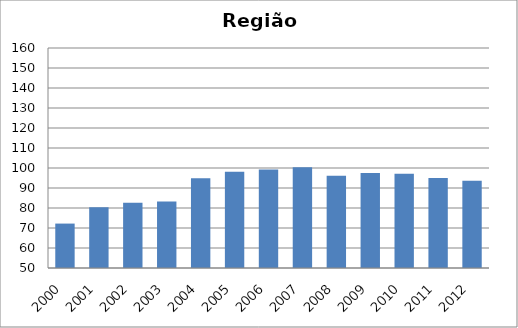
| Category | Hepatite B |
|---|---|
| 2000.0 | 72.21 |
| 2001.0 | 80.33 |
| 2002.0 | 82.59 |
| 2003.0 | 83.23 |
| 2004.0 | 94.93 |
| 2005.0 | 98.14 |
| 2006.0 | 99.24 |
| 2007.0 | 100.34 |
| 2008.0 | 96.17 |
| 2009.0 | 97.5 |
| 2010.0 | 97.11 |
| 2011.0 | 95.05 |
| 2012.0 | 93.63 |